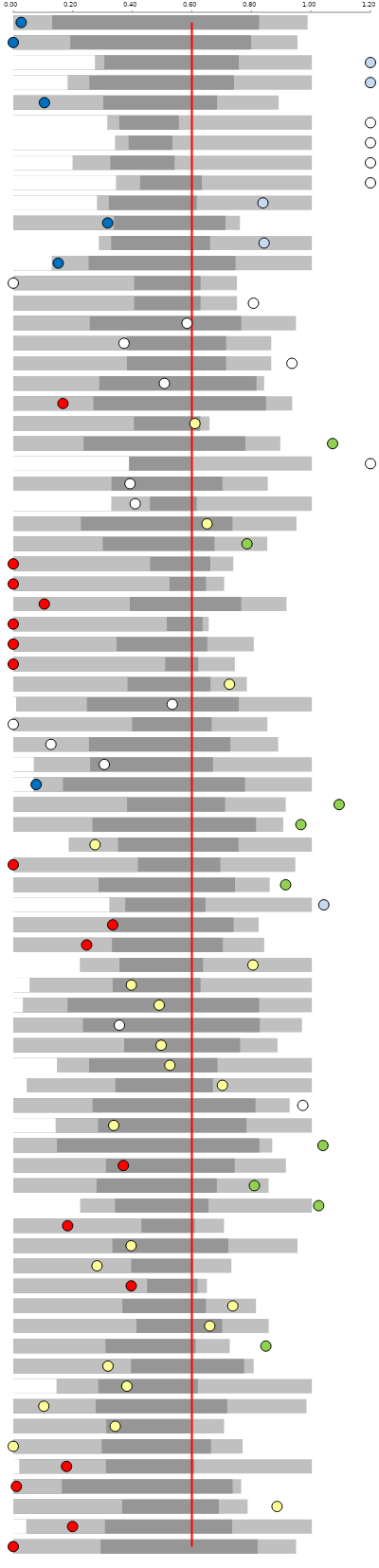
| Category | Best | Top quartile | Bottom quartile | Worst |
|---|---|---|---|---|
|  | 0.986 | 0.823 | 0.128 | 0 |
|  | 0.952 | 0.796 | 0.188 | 0 |
|  | 1 | 0.755 | 0.303 | 0.271 |
|  | 1 | 0.738 | 0.252 | 0.18 |
|  | 0.888 | 0.682 | 0.299 | 0 |
|  | 1 | 0.553 | 0.353 | 0.313 |
|  | 1 | 0.532 | 0.384 | 0.338 |
|  | 1 | 0.539 | 0.323 | 0.196 |
|  | 1 | 0.63 | 0.423 | 0.342 |
|  | 1 | 0.613 | 0.318 | 0.278 |
|  | 0.758 | 0.71 | 0.335 | 0 |
|  | 1 | 0.658 | 0.326 | 0.284 |
|  | 1 | 0.743 | 0.25 | 0.126 |
|  | 0.748 | 0.626 | 0.403 | 0 |
|  | 0.748 | 0.626 | 0.403 | 0 |
|  | 0.946 | 0.763 | 0.254 | 0 |
|  | 0.863 | 0.712 | 0.378 | 0 |
|  | 0.863 | 0.712 | 0.378 | 0 |
|  | 0.84 | 0.814 | 0.286 | 0 |
|  | 0.934 | 0.846 | 0.266 | 0 |
|  | 0.656 | 0.625 | 0.402 | 0 |
|  | 0.894 | 0.777 | 0.233 | 0 |
|  | 1 | 0.593 | 0.386 | 0.385 |
|  | 0.852 | 0.7 | 0.327 | 0 |
|  | 1 | 0.613 | 0.456 | 0.326 |
|  | 0.948 | 0.733 | 0.224 | 0 |
|  | 0.85 | 0.673 | 0.298 | 0 |
|  | 0.736 | 0.659 | 0.456 | 0 |
|  | 0.706 | 0.644 | 0.522 | 0 |
|  | 0.915 | 0.762 | 0.388 | 0 |
|  | 0.654 | 0.633 | 0.513 | 0 |
|  | 0.805 | 0.649 | 0.344 | 0 |
|  | 0.741 | 0.618 | 0.507 | 0 |
|  | 0.782 | 0.659 | 0.38 | 0 |
|  | 1 | 0.755 | 0.244 | 0.006 |
|  | 0.851 | 0.663 | 0.396 | 0 |
|  | 0.887 | 0.726 | 0.251 | 0 |
|  | 1 | 0.668 | 0.255 | 0.066 |
|  | 1 | 0.776 | 0.164 | 0.064 |
|  | 0.912 | 0.708 | 0.379 | 0 |
|  | 0.904 | 0.812 | 0.263 | 0 |
|  | 1 | 0.754 | 0.349 | 0.183 |
|  | 0.944 | 0.692 | 0.415 | 0 |
|  | 0.858 | 0.742 | 0.283 | 0 |
|  | 1 | 0.642 | 0.373 | 0.32 |
|  | 0.821 | 0.737 | 0.33 | 0 |
|  | 0.84 | 0.701 | 0.328 | 0 |
|  | 1 | 0.634 | 0.354 | 0.22 |
|  | 1 | 0.626 | 0.331 | 0.051 |
|  | 1 | 0.823 | 0.179 | 0.029 |
|  | 0.967 | 0.825 | 0.231 | 0 |
|  | 0.885 | 0.759 | 0.369 | 0 |
|  | 1 | 0.682 | 0.251 | 0.143 |
|  | 1 | 0.668 | 0.34 | 0.042 |
|  | 0.925 | 0.811 | 0.263 | 0 |
|  | 1 | 0.78 | 0.281 | 0.139 |
|  | 0.867 | 0.824 | 0.144 | 0 |
|  | 0.913 | 0.741 | 0.308 | 0 |
|  | 0.855 | 0.681 | 0.277 | 0 |
|  | 1 | 0.653 | 0.339 | 0.222 |
|  | 0.705 | 0.607 | 0.427 | 0 |
|  | 0.952 | 0.719 | 0.33 | 0 |
|  | 0.73 | 0.601 | 0.393 | 0 |
|  | 0.648 | 0.616 | 0.446 | 0 |
|  | 0.812 | 0.644 | 0.363 | 0 |
|  | 0.855 | 0.698 | 0.41 | 0 |
|  | 0.724 | 0.609 | 0.307 | 0 |
|  | 0.804 | 0.772 | 0.392 | 0 |
|  | 1 | 0.617 | 0.282 | 0.142 |
|  | 0.982 | 0.716 | 0.274 | 0 |
|  | 0.705 | 0.592 | 0.309 | 0 |
|  | 0.767 | 0.661 | 0.294 | 0 |
|  | 1 | 0.605 | 0.308 | 0.017 |
|  | 0.763 | 0.734 | 0.16 | 0 |
|  | 0.784 | 0.687 | 0.363 | 0 |
|  | 1 | 0.732 | 0.305 | 0.04 |
|  | 0.947 | 0.818 | 0.29 | 0 |